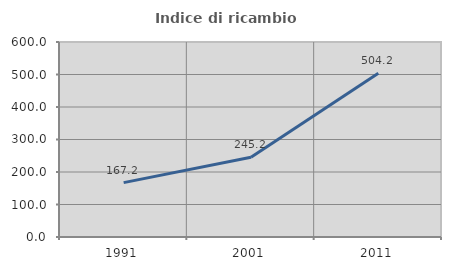
| Category | Indice di ricambio occupazionale  |
|---|---|
| 1991.0 | 167.241 |
| 2001.0 | 245.238 |
| 2011.0 | 504.167 |